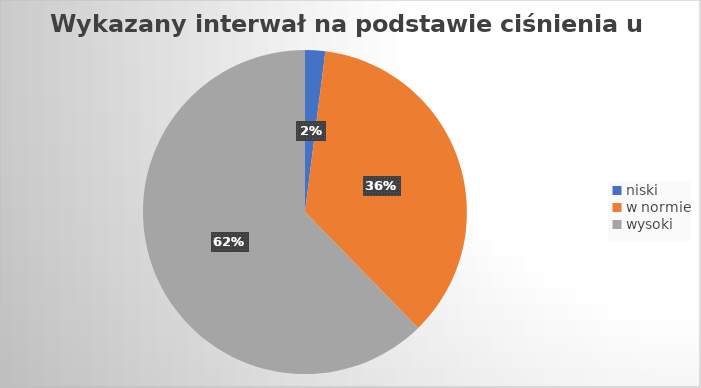
| Category | Series 0 |
|---|---|
| niski | 2.01 |
| w normie | 35.678 |
| wysoki | 62.312 |